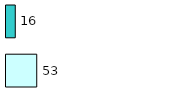
| Category | Series 0 | Series 1 |
|---|---|---|
| 0 | 53 | 16 |